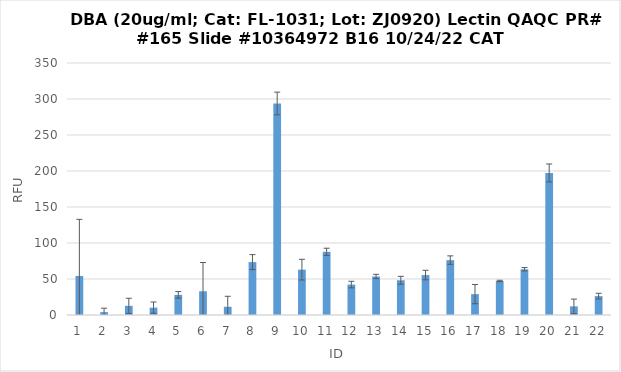
| Category | RFU |
|---|---|
| 0 | 54.25 |
| 1 | 4 |
| 2 | 12.75 |
| 3 | 10.25 |
| 4 | 28 |
| 5 | 33 |
| 6 | 11.5 |
| 7 | 73.5 |
| 8 | 293.75 |
| 9 | 63 |
| 10 | 87.75 |
| 11 | 42.25 |
| 12 | 53.5 |
| 13 | 48.25 |
| 14 | 55.5 |
| 15 | 76.25 |
| 16 | 29 |
| 17 | 47.25 |
| 18 | 63.5 |
| 19 | 197.25 |
| 20 | 12 |
| 21 | 26.25 |